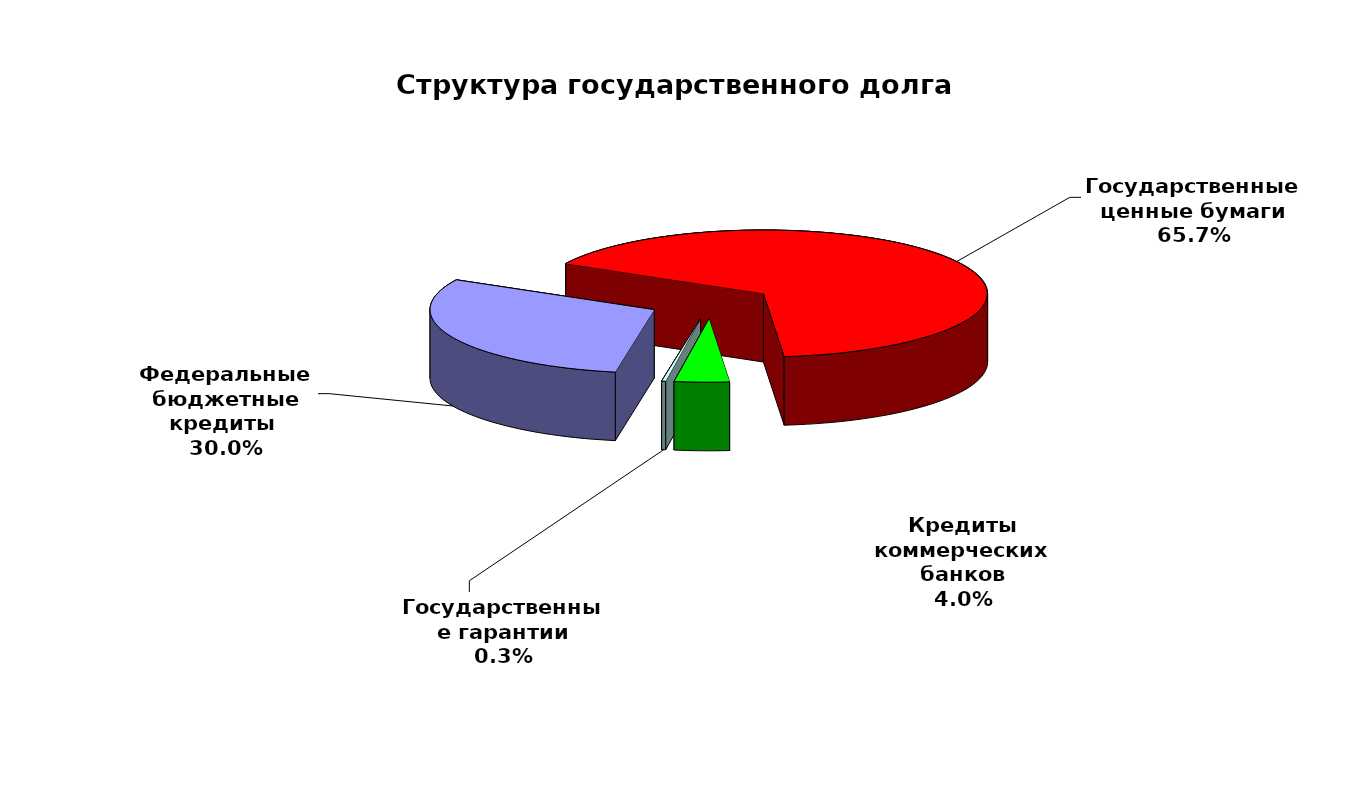
| Category | Series 0 |
|---|---|
| Федеральные бюджетные кредиты  | 18954967.5 |
| Государственные ценные бумаги | 41500000 |
| Кредиты коммерческих банков | 2500000 |
| Государственные гарантии | 184738.15 |